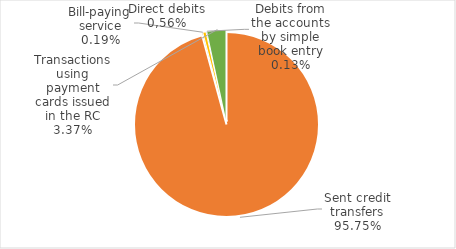
| Category | Total | Series 1 |
|---|---|---|
| 0 | 0 |  |
| 1 | 2317170691180 |  |
| 2 | 4561468089 |  |
| 3 | 13741833881 |  |
| 4 | 3089640346 |  |
| 5 | 81494909617 |  |